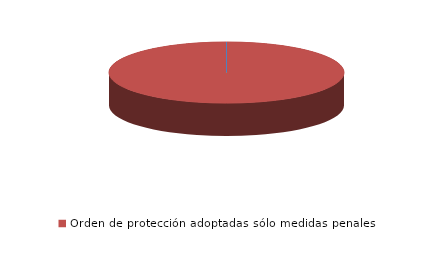
| Category | Series 0 |
|---|---|
| Orden de protección denegadas | 0 |
| Orden de protección adoptadas sólo medidas penales | 2 |
| Orden de protección adoptadas medidas penales y civiles | 0 |